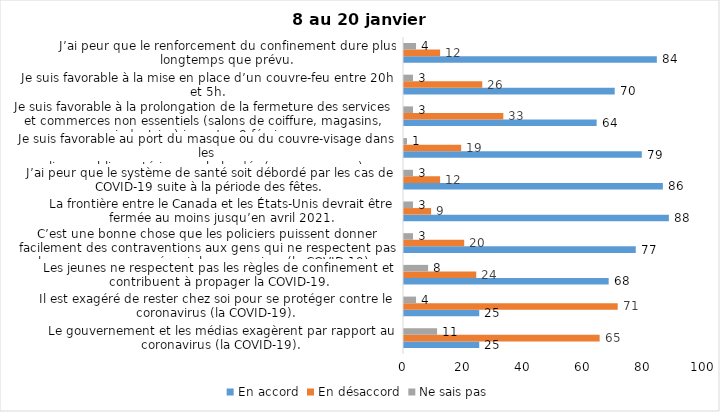
| Category | En accord | En désaccord | Ne sais pas |
|---|---|---|---|
| Le gouvernement et les médias exagèrent par rapport au coronavirus (la COVID-19). | 25 | 65 | 11 |
| Il est exagéré de rester chez soi pour se protéger contre le coronavirus (la COVID-19). | 25 | 71 | 4 |
| Les jeunes ne respectent pas les règles de confinement et contribuent à propager la COVID-19. | 68 | 24 | 8 |
| C’est une bonne chose que les policiers puissent donner facilement des contraventions aux gens qui ne respectent pas les mesures pour prévenir le coronavirus (la COVID-19). | 77 | 20 | 3 |
| La frontière entre le Canada et les États-Unis devrait être fermée au moins jusqu’en avril 2021. | 88 | 9 | 3 |
| J’ai peur que le système de santé soit débordé par les cas de COVID-19 suite à la période des fêtes. | 86 | 12 | 3 |
| Je suis favorable au port du masque ou du couvre-visage dans les
lieux publics extérieurs achalandés (ex. rues, parcs) | 79 | 19 | 1 |
| Je suis favorable à la prolongation de la fermeture des services et commerces non essentiels (salons de coiffure, magasins, industries) jusqu’au 8 février. | 64 | 33 | 3 |
| Je suis favorable à la mise en place d’un couvre-feu entre 20h et 5h. | 70 | 26 | 3 |
| J’ai peur que le renforcement du confinement dure plus longtemps que prévu. | 84 | 12 | 4 |